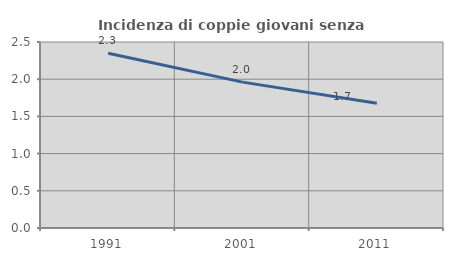
| Category | Incidenza di coppie giovani senza figli |
|---|---|
| 1991.0 | 2.349 |
| 2001.0 | 1.961 |
| 2011.0 | 1.678 |